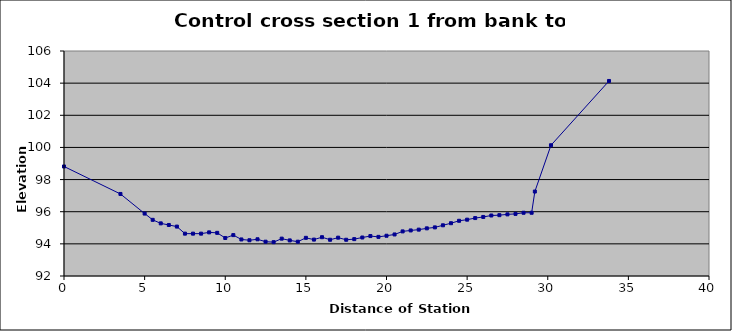
| Category | Series 0 |
|---|---|
| 0.0 | 98.815 |
| 3.5 | 97.105 |
| 5.0 | 95.885 |
| 5.5 | 95.495 |
| 6.0 | 95.275 |
| 6.5 | 95.175 |
| 7.0 | 95.075 |
| 7.5 | 94.635 |
| 8.0 | 94.635 |
| 8.5 | 94.635 |
| 9.0 | 94.715 |
| 9.5 | 94.685 |
| 10.0 | 94.365 |
| 10.5 | 94.545 |
| 11.0 | 94.275 |
| 11.5 | 94.225 |
| 12.0 | 94.285 |
| 12.5 | 94.135 |
| 13.0 | 94.105 |
| 13.5 | 94.325 |
| 14.0 | 94.215 |
| 14.5 | 94.135 |
| 15.0 | 94.375 |
| 15.5 | 94.265 |
| 16.0 | 94.415 |
| 16.5 | 94.255 |
| 17.0 | 94.385 |
| 17.5 | 94.255 |
| 18.0 | 94.295 |
| 18.5 | 94.395 |
| 19.0 | 94.485 |
| 19.5 | 94.435 |
| 20.0 | 94.505 |
| 20.5 | 94.585 |
| 21.0 | 94.775 |
| 21.5 | 94.835 |
| 22.0 | 94.885 |
| 22.5 | 94.965 |
| 23.0 | 95.025 |
| 23.5 | 95.155 |
| 24.0 | 95.285 |
| 24.5 | 95.435 |
| 25.0 | 95.505 |
| 25.5 | 95.605 |
| 26.0 | 95.675 |
| 26.5 | 95.765 |
| 27.0 | 95.785 |
| 27.5 | 95.835 |
| 28.0 | 95.865 |
| 28.5 | 95.935 |
| 29.0 | 95.935 |
| 29.2 | 97.255 |
| 30.2 | 100.135 |
| 33.8 | 104.135 |